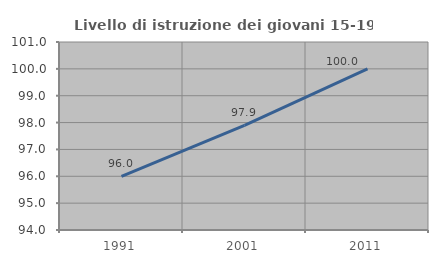
| Category | Livello di istruzione dei giovani 15-19 anni |
|---|---|
| 1991.0 | 96 |
| 2001.0 | 97.895 |
| 2011.0 | 100 |